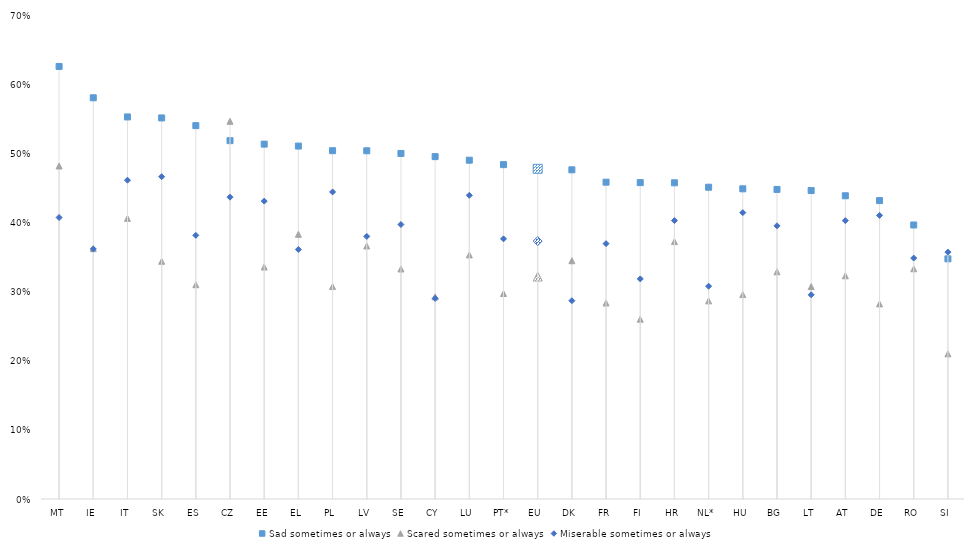
| Category | Sad sometimes or always | Scared sometimes or always | Miserable sometimes or always |
|---|---|---|---|
| MT | 0.626 | 0.482 | 0.407 |
| IE | 0.58 | 0.362 | 0.362 |
| IT | 0.553 | 0.406 | 0.461 |
| SK | 0.551 | 0.344 | 0.466 |
| ES | 0.54 | 0.31 | 0.381 |
| CZ | 0.518 | 0.546 | 0.437 |
| EE | 0.513 | 0.336 | 0.431 |
| EL | 0.51 | 0.383 | 0.361 |
| PL | 0.504 | 0.307 | 0.444 |
| LV | 0.504 | 0.366 | 0.38 |
| SE | 0.5 | 0.333 | 0.397 |
| CY | 0.495 | 0.292 | 0.29 |
| LU | 0.49 | 0.353 | 0.439 |
| PT* | 0.484 | 0.297 | 0.376 |
| EU | 0.478 | 0.322 | 0.373 |
| DK | 0.476 | 0.345 | 0.287 |
| FR | 0.458 | 0.283 | 0.369 |
| FI | 0.458 | 0.26 | 0.318 |
| HR | 0.457 | 0.372 | 0.403 |
| NL* | 0.451 | 0.287 | 0.308 |
| HU | 0.449 | 0.296 | 0.414 |
| BG | 0.448 | 0.329 | 0.395 |
| LT | 0.446 | 0.307 | 0.295 |
| AT | 0.439 | 0.323 | 0.403 |
| DE | 0.432 | 0.282 | 0.41 |
| RO | 0.396 | 0.333 | 0.348 |
| SI | 0.347 | 0.21 | 0.357 |